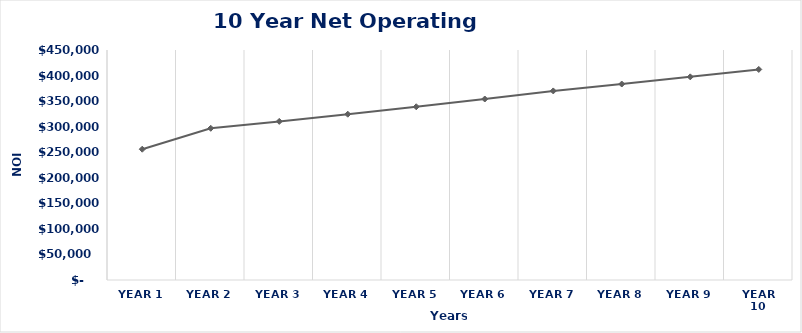
| Category | Series 0 |
|---|---|
| Year 1 | 255900.71 |
| Year 2 | 296841.749 |
| Year 3 | 310330.502 |
| Year 4 | 324361.202 |
| Year 5 | 338953.591 |
| Year 6 | 354128.103 |
| Year 7 | 369905.873 |
| Year 8 | 383441.614 |
| Year 9 | 397453.077 |
| Year 10 | 411955.929 |